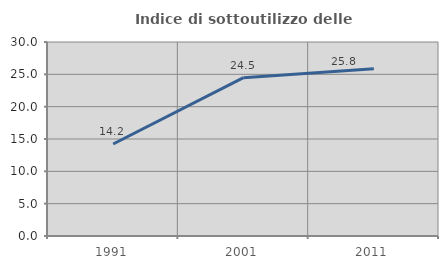
| Category | Indice di sottoutilizzo delle abitazioni  |
|---|---|
| 1991.0 | 14.224 |
| 2001.0 | 24.481 |
| 2011.0 | 25.847 |